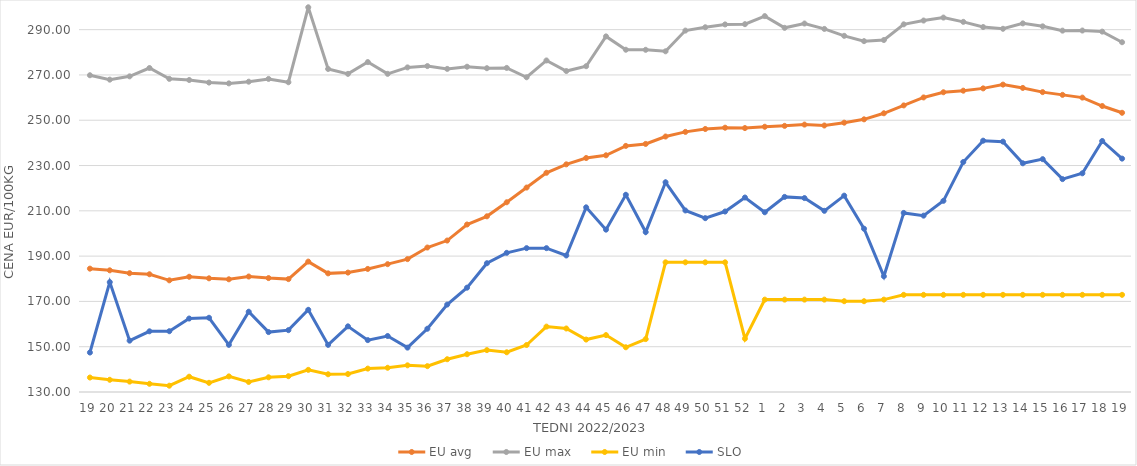
| Category | EU avg | EU max | EU min | SLO |
|---|---|---|---|---|
| 19.0 | 184.47 | 269.87 | 136.387 | 147.43 |
| 20.0 | 183.734 | 267.92 | 135.392 | 178.51 |
| 21.0 | 182.45 | 269.38 | 134.589 | 152.67 |
| 22.0 | 181.991 | 273.06 | 133.621 | 156.8 |
| 23.0 | 179.308 | 268.27 | 132.787 | 156.84 |
| 24.0 | 180.886 | 267.77 | 136.75 | 162.44 |
| 25.0 | 180.2 | 266.63 | 134.058 | 162.78 |
| 26.0 | 179.77 | 266.27 | 136.895 | 150.82 |
| 27.0 | 180.992 | 267.02 | 134.44 | 165.45 |
| 28.0 | 180.305 | 268.25 | 136.486 | 156.46 |
| 29.0 | 179.847 | 266.77 | 136.97 | 157.31 |
| 30.0 | 187.576 | 299.87 | 139.777 | 166.29 |
| 31.0 | 182.385 | 272.64 | 137.828 | 150.81 |
| 32.0 | 182.73 | 270.47 | 137.934 | 158.99 |
| 33.0 | 184.343 | 275.68 | 140.33 | 152.91 |
| 34.0 | 186.448 | 270.49 | 140.7 | 154.73 |
| 35.0 | 188.684 | 273.33 | 141.78 | 149.6 |
| 36.0 | 193.792 | 273.91 | 141.41 | 157.93 |
| 37.0 | 196.877 | 272.67 | 144.47 | 168.61 |
| 38.0 | 203.962 | 273.63 | 146.68 | 176.07 |
| 39.0 | 207.574 | 272.98 | 148.499 | 186.86 |
| 40.0 | 213.785 | 273.1 | 147.54 | 191.45 |
| 41.0 | 220.272 | 268.98 | 150.75 | 193.52 |
| 42.0 | 226.803 | 276.39 | 158.87 | 193.52 |
| 43.0 | 230.521 | 271.72 | 158.04 | 190.28 |
| 44.0 | 233.325 | 273.856 | 153.16 | 211.53 |
| 45.0 | 234.517 | 287.021 | 155.13 | 201.69 |
| 46.0 | 238.669 | 281.133 | 149.75 | 217.08 |
| 47.0 | 239.534 | 281.102 | 153.36 | 200.62 |
| 48.0 | 242.81 | 280.434 | 187.26 | 222.61 |
| 49.0 | 244.854 | 289.585 | 187.26 | 210.16 |
| 50.0 | 246.132 | 291.057 | 187.26 | 206.76 |
| 51.0 | 246.705 | 292.307 | 187.26 | 209.69 |
| 52.0 | 246.546 | 292.426 | 153.54 | 215.87 |
| 1.0 | 247.118 | 295.98 | 170.79 | 209.37 |
| 2.0 | 247.516 | 290.8 | 170.79 | 216.15 |
| 3.0 | 248.079 | 292.71 | 170.79 | 215.63 |
| 4.0 | 247.672 | 290.32 | 170.79 | 210 |
| 5.0 | 248.924 | 287.27 | 170.09 | 216.7 |
| 6.0 | 250.4 | 284.92 | 170.09 | 202.1 |
| 7.0 | 253.074 | 285.42 | 170.79 | 181.11 |
| 8.0 | 256.543 | 292.35 | 172.91 | 209.08 |
| 9.0 | 260.066 | 294.02 | 172.91 | 207.87 |
| 10.0 | 262.352 | 295.33 | 172.91 | 214.42 |
| 11.0 | 263.049 | 293.44 | 172.91 | 231.56 |
| 12.0 | 264.068 | 291.15 | 172.91 | 240.97 |
| 13.0 | 265.73 | 290.38 | 172.91 | 240.55 |
| 14.0 | 264.262 | 292.763 | 172.91 | 230.99 |
| 15.0 | 262.411 | 291.46 | 172.91 | 232.82 |
| 16.0 | 261.202 | 289.56 | 172.91 | 224 |
| 17.0 | 259.994 | 289.61 | 172.91 | 226.57 |
| 18.0 | 256.282 | 289.13 | 172.91 | 240.83 |
| 19.0 | 253.292 | 284.45 | 172.91 | 233.05 |